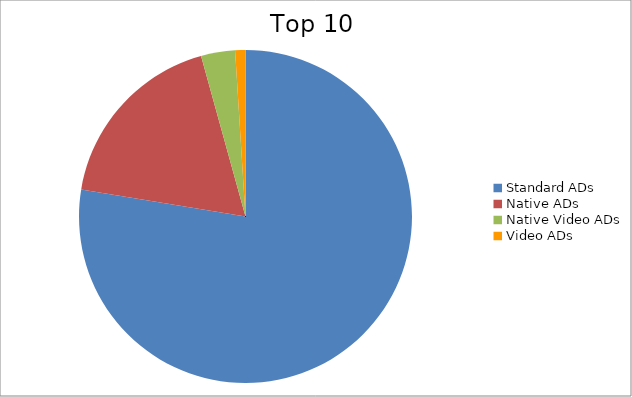
| Category | Series 0 |
|---|---|
| Standard ADs | 77.6 |
| Native ADs | 18.1 |
| Native Video ADs | 3.3 |
| Video ADs | 1 |